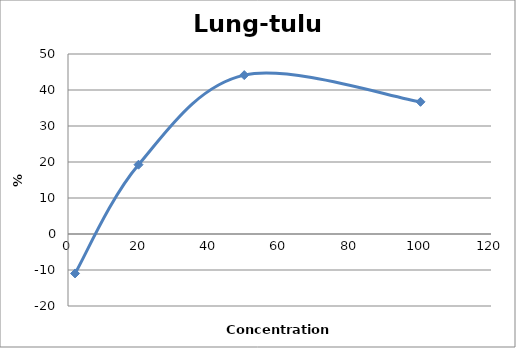
| Category | Lung-tulu4 |
|---|---|
| 100.0 | 36.712 |
| 50.0 | 44.138 |
| 20.0 | 19.251 |
| 2.0 | -10.959 |
| nan | 0 |
| nan | 0 |
| nan | 0 |
| nan | 0 |
| nan | 0 |